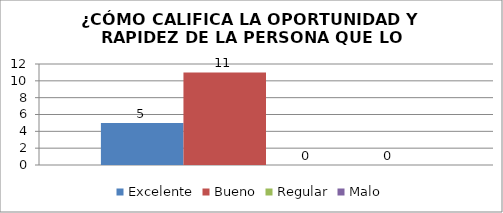
| Category | Excelente | Bueno | Regular | Malo |
|---|---|---|---|---|
| 0 | 5 | 11 | 0 | 0 |